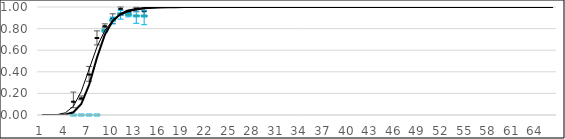
| Category | observed - MN | observed-RI | expected - published | expected - updated |
|---|---|---|---|---|
| 0 | -1 | -1 | 0 | 0 |
| 1 | -1 | -1 | 0 | 0 |
| 2 | -1 | -1 | 0.004 | 0 |
| 3 | -1 | -1 | 0.021 | 0.004 |
| 4 | 0.128 | 0 | 0.081 | 0.026 |
| 5 | 0.158 | 0 | 0.218 | 0.101 |
| 6 | 0.379 | 0 | 0.424 | 0.28 |
| 7 | 0.717 | 0 | 0.631 | 0.531 |
| 8 | 0.826 | 0.781 | 0.782 | 0.744 |
| 9 | 0.899 | 0.878 | 0.875 | 0.871 |
| 10 | 0.986 | 0.937 | 0.927 | 0.936 |
| 11 | 0.961 | 0.929 | 0.957 | 0.967 |
| 12 | 0.985 | 0.917 | 0.973 | 0.982 |
| 13 | 0.965 | 0.917 | 0.983 | 0.99 |
| 14 | -1 | -1 | 0.989 | 0.994 |
| 15 | -1 | -1 | 0.993 | 0.997 |
| 16 | -1 | -1 | 0.995 | 0.998 |
| 17 | -1 | -1 | 0.996 | 0.999 |
| 18 | -1 | -1 | 0.997 | 0.999 |
| 19 | -1 | -1 | 0.998 | 0.999 |
| 20 | -1 | -1 | 0.999 | 1 |
| 21 | -1 | -1 | 0.999 | 1 |
| 22 | -1 | -1 | 0.999 | 1 |
| 23 | -1 | -1 | 0.999 | 1 |
| 24 | -1 | -1 | 1 | 1 |
| 25 | -1 | -1 | 1 | 1 |
| 26 | -1 | -1 | 1 | 1 |
| 27 | -1 | -1 | 1 | 1 |
| 28 | -1 | -1 | 1 | 1 |
| 29 | -1 | -1 | 1 | 1 |
| 30 | -1 | -1 | 1 | 1 |
| 31 | -1 | -1 | 1 | 1 |
| 32 | -1 | -1 | 1 | 1 |
| 33 | -1 | -1 | 1 | 1 |
| 34 | -1 | -1 | 1 | 1 |
| 35 | -1 | -1 | 1 | 1 |
| 36 | -1 | -1 | 1 | 1 |
| 37 | -1 | -1 | 1 | 1 |
| 38 | -1 | -1 | 1 | 1 |
| 39 | -1 | -1 | 1 | 1 |
| 40 | -1 | -1 | 1 | 1 |
| 41 | -1 | -1 | 1 | 1 |
| 42 | -1 | -1 | 1 | 1 |
| 43 | -1 | -1 | 1 | 1 |
| 44 | -1 | -1 | 1 | 1 |
| 45 | -1 | -1 | 1 | 1 |
| 46 | -1 | -1 | 1 | 1 |
| 47 | -1 | -1 | 1 | 1 |
| 48 | -1 | -1 | 1 | 1 |
| 49 | -1 | -1 | 1 | 1 |
| 50 | -1 | -1 | 1 | 1 |
| 51 | -1 | -1 | 1 | 1 |
| 52 | -1 | -1 | 1 | 1 |
| 53 | -1 | -1 | 1 | 1 |
| 54 | -1 | -1 | 1 | 1 |
| 55 | -1 | -1 | 1 | 1 |
| 56 | -1 | -1 | 1 | 1 |
| 57 | -1 | -1 | 1 | 1 |
| 58 | -1 | -1 | 1 | 1 |
| 59 | -1 | -1 | 1 | 1 |
| 60 | -1 | -1 | 1 | 1 |
| 61 | -1 | -1 | 1 | 1 |
| 62 | -1 | -1 | 1 | 1 |
| 63 | -1 | -1 | 1 | 1 |
| 64 | -1 | -1 | 1 | 1 |
| 65 | -1 | -1 | 1 | 1 |